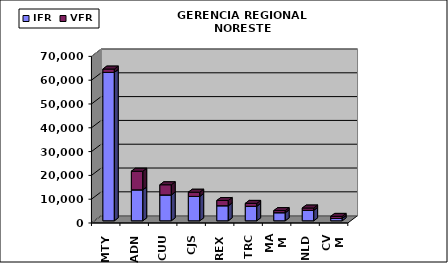
| Category | IFR | VFR |
|---|---|---|
| MTY | 62354 | 1393 |
| ADN | 13001 | 7828 |
| CUU | 10865 | 4265 |
| CJS | 10240 | 1776 |
| REX | 6327 | 2204 |
| TRC | 6098 | 1226 |
| MAM | 3398 | 890 |
| NLD | 4413 | 956 |
| CVM | 987 | 877 |